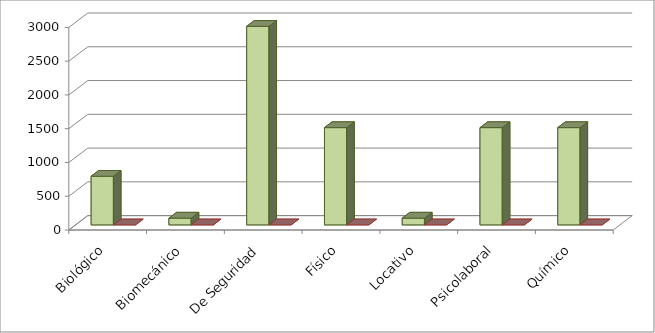
| Category | Series 0 | Series 1 |
|---|---|---|
| Biológico | 720 | 0 |
| Biomecánico | 100 | 0 |
| De Seguridad | 2940 | 0 |
| Físico | 1440 | 0 |
| Locativo | 100 | 0 |
| Psicolaboral | 1440 | 0 |
| Químico | 1440 | 0 |